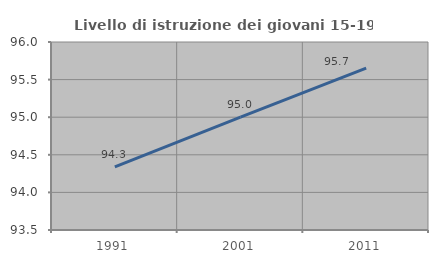
| Category | Livello di istruzione dei giovani 15-19 anni |
|---|---|
| 1991.0 | 94.34 |
| 2001.0 | 95 |
| 2011.0 | 95.652 |